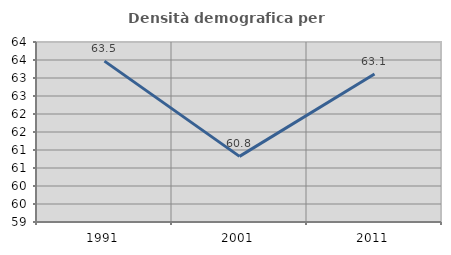
| Category | Densità demografica |
|---|---|
| 1991.0 | 63.469 |
| 2001.0 | 60.823 |
| 2011.0 | 63.111 |